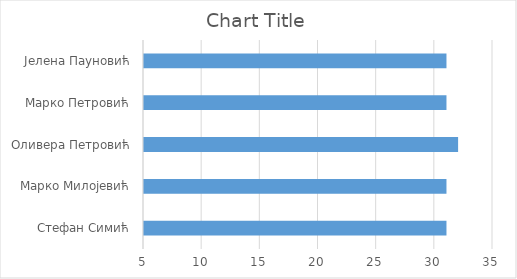
| Category | Series 0 |
|---|---|
| Стефан Симић | 31 |
| Марко Милојевић | 31 |
| Оливера Петровић | 32 |
| Марко Петровић | 31 |
| Јелена Пауновић | 31 |